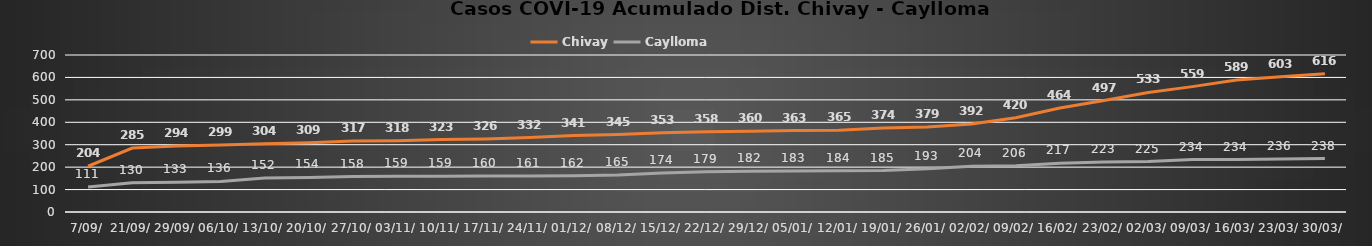
| Category | Chivay | Caylloma |
|---|---|---|
| 7/09/ | 204 | 111 |
| 21/09/ | 285 | 130 |
| 29/09/ | 294 | 133 |
| 06/10/ | 299 | 136 |
| 13/10/ | 304 | 152 |
| 20/10/ | 309 | 154 |
| 27/10/ | 317 | 158 |
| 03/11/ | 318 | 159 |
| 10/11/ | 323 | 159 |
| 17/11/ | 326 | 160 |
| 24/11/ | 332 | 161 |
| 01/12/ | 341 | 162 |
| 08/12/ | 345 | 165 |
| 15/12/ | 353 | 174 |
| 22/12/ | 358 | 179 |
| 29/12/ | 360 | 182 |
| 05/01/ | 363 | 183 |
| 12/01/ | 365 | 184 |
| 19/01/ | 374 | 185 |
| 26/01/ | 379 | 193 |
| 02/02/ | 392 | 204 |
| 09/02/ | 420 | 206 |
| 16/02/ | 464 | 217 |
| 23/02/ | 497 | 223 |
| 02/03/ | 533 | 225 |
| 09/03/ | 559 | 234 |
| 16/03/ | 589 | 234 |
| 23/03/ | 603 | 236 |
| 30/03/ | 616 | 238 |